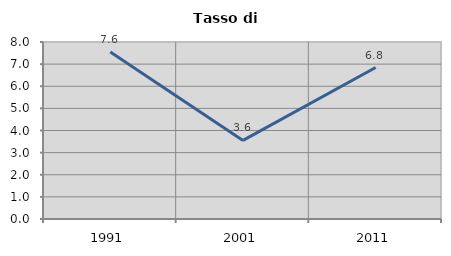
| Category | Tasso di disoccupazione   |
|---|---|
| 1991.0 | 7.551 |
| 2001.0 | 3.552 |
| 2011.0 | 6.847 |